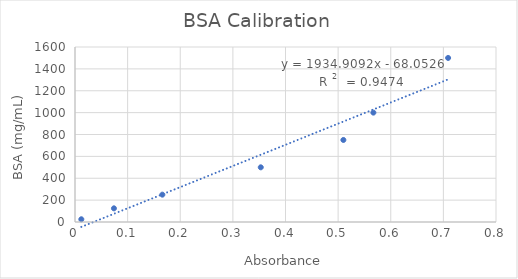
| Category | Series 0 |
|---|---|
| 0.7089999999999999 | 1500 |
| 0.567 | 1000 |
| 0.51 | 750 |
| 0.35300000000000004 | 500 |
| 0.16600000000000004 | 250 |
| 0.07400000000000001 | 125 |
| 0.01200000000000001 | 25 |